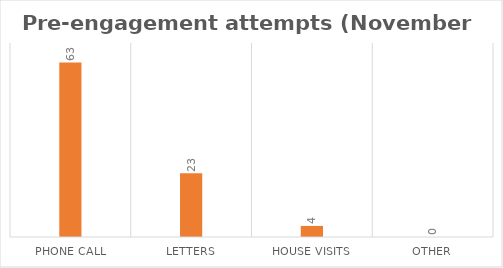
| Category | Series 0 |
|---|---|
| Phone call | 63 |
| Letters | 23 |
| House Visits | 4 |
| Other | 0 |